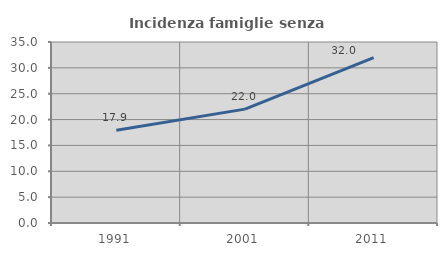
| Category | Incidenza famiglie senza nuclei |
|---|---|
| 1991.0 | 17.917 |
| 2001.0 | 22.017 |
| 2011.0 | 31.975 |